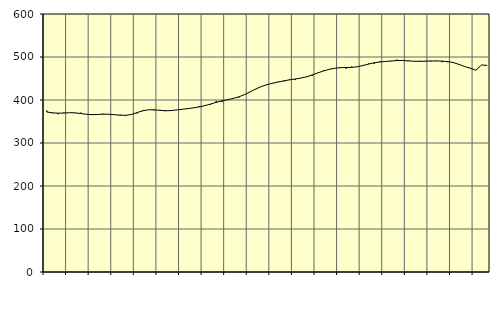
| Category | Piggar | Series 1 |
|---|---|---|
| nan | 375.2 | 372.1 |
| 1.0 | 369 | 370.19 |
| 1.0 | 366.9 | 369.26 |
| 1.0 | 370.7 | 369.73 |
| nan | 370.7 | 370.53 |
| 2.0 | 369.6 | 370.08 |
| 2.0 | 370.7 | 368.57 |
| 2.0 | 366.3 | 366.8 |
| nan | 365.2 | 365.92 |
| 3.0 | 366 | 366.35 |
| 3.0 | 368.2 | 367.04 |
| 3.0 | 367 | 366.92 |
| nan | 365.2 | 365.75 |
| 4.0 | 366.1 | 364.55 |
| 4.0 | 362.6 | 364.4 |
| 4.0 | 366.7 | 366.4 |
| nan | 368.7 | 370.68 |
| 5.0 | 376.3 | 374.91 |
| 5.0 | 376.8 | 377.21 |
| 5.0 | 376 | 377.16 |
| nan | 376.8 | 375.98 |
| 6.0 | 374 | 375.1 |
| 6.0 | 375.2 | 375.39 |
| 6.0 | 377.2 | 376.83 |
| nan | 378.3 | 378.43 |
| 7.0 | 380 | 379.92 |
| 7.0 | 381.5 | 381.76 |
| 7.0 | 385.5 | 383.94 |
| nan | 387.5 | 386.9 |
| 8.0 | 388.7 | 390.66 |
| 8.0 | 397.6 | 394.47 |
| 8.0 | 395.2 | 397.84 |
| nan | 401.1 | 400.61 |
| 9.0 | 404.8 | 403.63 |
| 9.0 | 405.4 | 407.33 |
| 9.0 | 413 | 412.36 |
| nan | 419.4 | 418.83 |
| 10.0 | 425 | 425.55 |
| 10.0 | 432 | 431.32 |
| 10.0 | 436.7 | 435.79 |
| nan | 438.4 | 439.07 |
| 11.0 | 442.8 | 441.8 |
| 11.0 | 443.2 | 444.6 |
| 11.0 | 448 | 446.9 |
| nan | 446.4 | 448.89 |
| 12.0 | 450.7 | 451.03 |
| 12.0 | 454.6 | 453.88 |
| 12.0 | 456.2 | 458.16 |
| nan | 463.4 | 462.97 |
| 13.0 | 469.2 | 467.51 |
| 13.0 | 470.5 | 471.28 |
| 13.0 | 474.1 | 473.86 |
| nan | 476 | 475.19 |
| 14.0 | 472.9 | 475.44 |
| 14.0 | 477.7 | 475.8 |
| 14.0 | 477 | 477.44 |
| nan | 479.3 | 480.17 |
| 15.0 | 484.8 | 483.54 |
| 15.0 | 484.1 | 486.6 |
| 15.0 | 490.1 | 488.43 |
| nan | 489.5 | 489.62 |
| 16.0 | 490.1 | 490.76 |
| 16.0 | 494.1 | 491.71 |
| 16.0 | 492.9 | 491.8 |
| nan | 492.3 | 490.98 |
| 17.0 | 489.7 | 490.1 |
| 17.0 | 491.1 | 489.94 |
| 17.0 | 490.6 | 490.37 |
| nan | 489.3 | 490.81 |
| 18.0 | 491.6 | 490.83 |
| 18.0 | 487.9 | 490.46 |
| 18.0 | 487.8 | 489.38 |
| nan | 487.6 | 486.98 |
| 19.0 | 482.6 | 482.87 |
| 19.0 | 477.4 | 477.9 |
| 19.0 | 473.2 | 474.1 |
| nan | 469 | 469.25 |
| 20.0 | 481.6 | 481.42 |
| 20.0 | 480.6 | 480.4 |